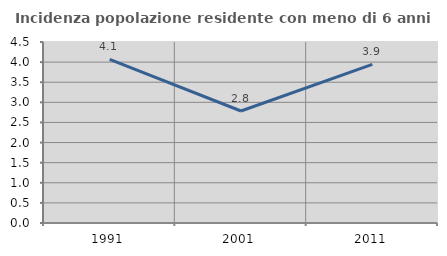
| Category | Incidenza popolazione residente con meno di 6 anni |
|---|---|
| 1991.0 | 4.07 |
| 2001.0 | 2.785 |
| 2011.0 | 3.943 |